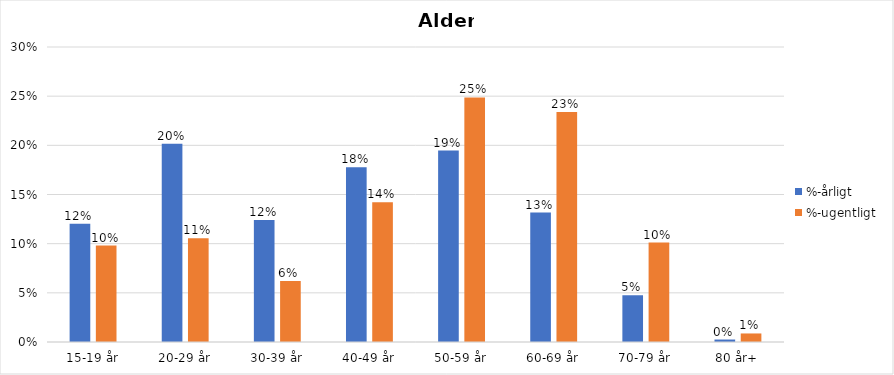
| Category | %-årligt | %-ugentligt |
|---|---|---|
| 15-19 år | 0.12 | 0.098 |
| 20-29 år | 0.202 | 0.105 |
| 30-39 år | 0.124 | 0.062 |
| 40-49 år | 0.178 | 0.142 |
| 50-59 år | 0.195 | 0.249 |
| 60-69 år | 0.132 | 0.234 |
| 70-79 år | 0.048 | 0.101 |
| 80 år+ | 0.003 | 0.009 |